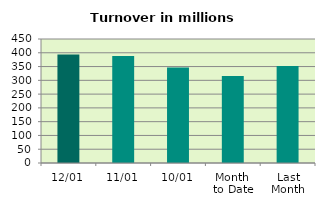
| Category | Series 0 |
|---|---|
| 12/01 | 393.781 |
| 11/01 | 388.372 |
| 10/01 | 346.617 |
| Month 
to Date | 316.054 |
| Last
Month | 352.227 |